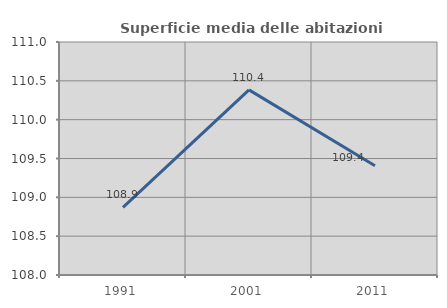
| Category | Superficie media delle abitazioni occupate |
|---|---|
| 1991.0 | 108.87 |
| 2001.0 | 110.384 |
| 2011.0 | 109.407 |